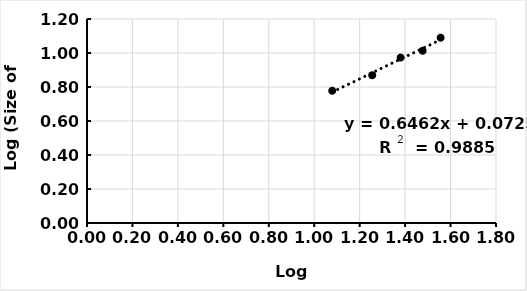
| Category | Series 0 |
|---|---|
| 1.0791812460476249 | 0.778 |
| 1.255272505103306 | 0.869 |
| 1.380211241711606 | 0.973 |
| 1.4771212547196624 | 1.013 |
| 1.5563025007672873 | 1.09 |